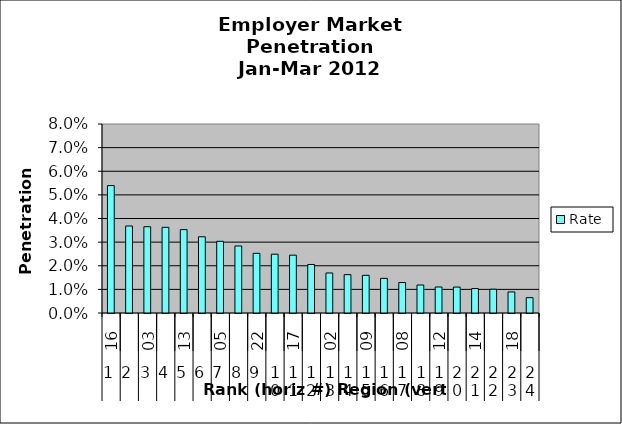
| Category | Rate |
|---|---|
| 0 | 0.054 |
| 1 | 0.037 |
| 2 | 0.037 |
| 3 | 0.036 |
| 4 | 0.035 |
| 5 | 0.032 |
| 6 | 0.03 |
| 7 | 0.028 |
| 8 | 0.025 |
| 9 | 0.025 |
| 10 | 0.024 |
| 11 | 0.021 |
| 12 | 0.017 |
| 13 | 0.016 |
| 14 | 0.016 |
| 15 | 0.015 |
| 16 | 0.013 |
| 17 | 0.012 |
| 18 | 0.011 |
| 19 | 0.011 |
| 20 | 0.01 |
| 21 | 0.01 |
| 22 | 0.009 |
| 23 | 0.006 |